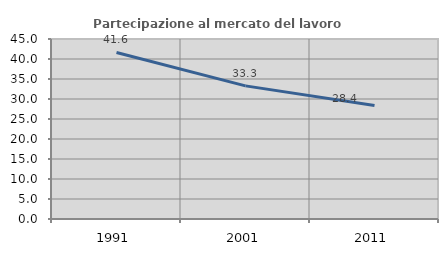
| Category | Partecipazione al mercato del lavoro  femminile |
|---|---|
| 1991.0 | 41.633 |
| 2001.0 | 33.282 |
| 2011.0 | 28.361 |